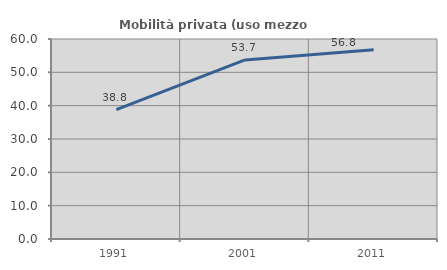
| Category | Mobilità privata (uso mezzo privato) |
|---|---|
| 1991.0 | 38.83 |
| 2001.0 | 53.731 |
| 2011.0 | 56.777 |